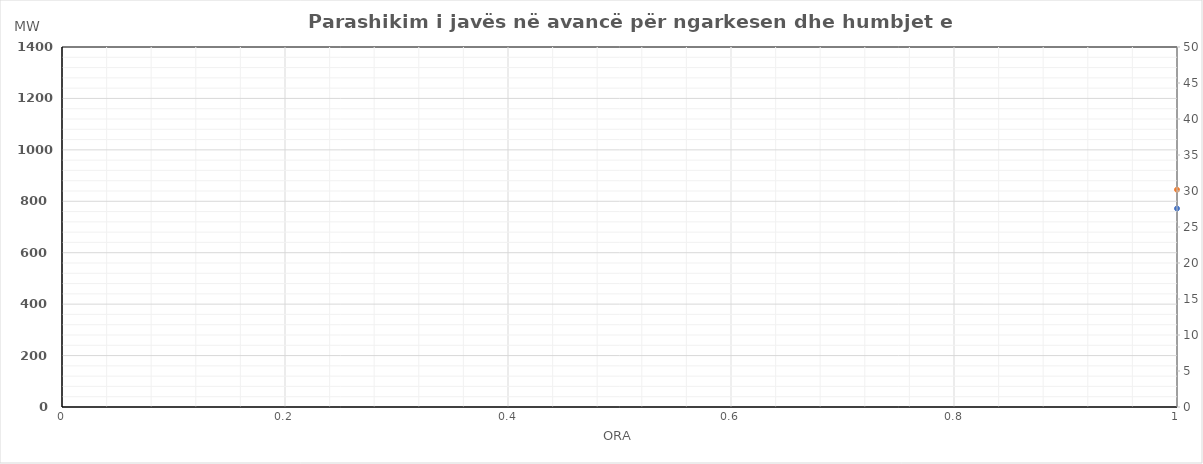
| Category | Ngarkesa (MWh) |
|---|---|
| 0 | 845.003 |
| 1 | 731.034 |
| 2 | 620.068 |
| 3 | 553.72 |
| 4 | 522.735 |
| 5 | 528.399 |
| 6 | 574.023 |
| 7 | 660.235 |
| 8 | 801.486 |
| 9 | 912.568 |
| 10 | 968.763 |
| 11 | 982.38 |
| 12 | 963.607 |
| 13 | 945.921 |
| 14 | 939.475 |
| 15 | 940.598 |
| 16 | 1009.299 |
| 17 | 1070.218 |
| 18 | 1063.275 |
| 19 | 1035.673 |
| 20 | 994.653 |
| 21 | 924.46 |
| 22 | 832.799 |
| 23 | 722.018 |
| 24 | 610.016 |
| 25 | 529.125 |
| 26 | 485.514 |
| 27 | 463.558 |
| 28 | 462.054 |
| 29 | 487.243 |
| 30 | 558.531 |
| 31 | 670.736 |
| 32 | 829.245 |
| 33 | 933.317 |
| 34 | 947.266 |
| 35 | 932.415 |
| 36 | 926.544 |
| 37 | 918.693 |
| 38 | 905.743 |
| 39 | 918.869 |
| 40 | 997.667 |
| 41 | 1091.444 |
| 42 | 1099.592 |
| 43 | 1096.812 |
| 44 | 1079.461 |
| 45 | 1013.236 |
| 46 | 895.246 |
| 47 | 752.821 |
| 48 | 624.018 |
| 49 | 542.867 |
| 50 | 501.128 |
| 51 | 482.762 |
| 52 | 487.08 |
| 53 | 532.168 |
| 54 | 652.892 |
| 55 | 841.205 |
| 56 | 1021.273 |
| 57 | 1112.664 |
| 58 | 1143.921 |
| 59 | 1148.519 |
| 60 | 1139.478 |
| 61 | 1130.575 |
| 62 | 1108.446 |
| 63 | 1114.754 |
| 64 | 1154.687 |
| 65 | 1213.879 |
| 66 | 1207.887 |
| 67 | 1196.634 |
| 68 | 1161.818 |
| 69 | 1072.556 |
| 70 | 941.051 |
| 71 | 771.874 |
| 72 | 636.92 |
| 73 | 554.135 |
| 74 | 511.76 |
| 75 | 487.52 |
| 76 | 495.992 |
| 77 | 550.239 |
| 78 | 683.388 |
| 79 | 884.873 |
| 80 | 1048.151 |
| 81 | 1104.565 |
| 82 | 1125.234 |
| 83 | 1131.814 |
| 84 | 1134.247 |
| 85 | 1141.003 |
| 86 | 1109.89 |
| 87 | 1088.518 |
| 88 | 1129.954 |
| 89 | 1223.74 |
| 90 | 1229.584 |
| 91 | 1209.547 |
| 92 | 1173.603 |
| 93 | 1089.924 |
| 94 | 947.939 |
| 95 | 782.047 |
| 96 | 645.429 |
| 97 | 559.883 |
| 98 | 524.295 |
| 99 | 513.535 |
| 100 | 518.136 |
| 101 | 570.642 |
| 102 | 715.544 |
| 103 | 931.521 |
| 104 | 1075.489 |
| 105 | 1087.652 |
| 106 | 1042.195 |
| 107 | 1012.424 |
| 108 | 1008.841 |
| 109 | 1040.809 |
| 110 | 1066.383 |
| 111 | 1080.767 |
| 112 | 1135.428 |
| 113 | 1230.071 |
| 114 | 1231.263 |
| 115 | 1198.813 |
| 116 | 1159.447 |
| 117 | 1063.945 |
| 118 | 925.869 |
| 119 | 761.08 |
| 120 | 635.337 |
| 121 | 556.331 |
| 122 | 514.532 |
| 123 | 497.955 |
| 124 | 501.757 |
| 125 | 551.79 |
| 126 | 667.453 |
| 127 | 829.049 |
| 128 | 982.282 |
| 129 | 1049.667 |
| 130 | 1070.366 |
| 131 | 1059.516 |
| 132 | 1041.374 |
| 133 | 1054.913 |
| 134 | 1069.281 |
| 135 | 1076.991 |
| 136 | 1125.091 |
| 137 | 1177.812 |
| 138 | 1159.778 |
| 139 | 1124.387 |
| 140 | 1076.932 |
| 141 | 1002.418 |
| 142 | 883.604 |
| 143 | 737.541 |
| 144 | 617.957 |
| 145 | 544.882 |
| 146 | 506.835 |
| 147 | 488.947 |
| 148 | 493.581 |
| 149 | 531.252 |
| 150 | 617.742 |
| 151 | 752.442 |
| 152 | 911.527 |
| 153 | 1020.414 |
| 154 | 1078.999 |
| 155 | 1107.254 |
| 156 | 1124.853 |
| 157 | 1140.916 |
| 158 | 1137.778 |
| 159 | 1153.157 |
| 160 | 1221.678 |
| 161 | 1286.525 |
| 162 | 1297.428 |
| 163 | 1288.562 |
| 164 | 1248.195 |
| 165 | 1130.369 |
| 166 | 963.037 |
| 167 | 765.209 |